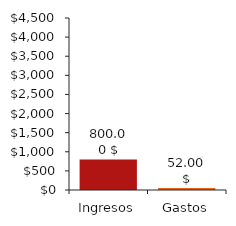
| Category | Datos del gráfico |
|---|---|
| 0 | 800 |
| 1 | 52 |